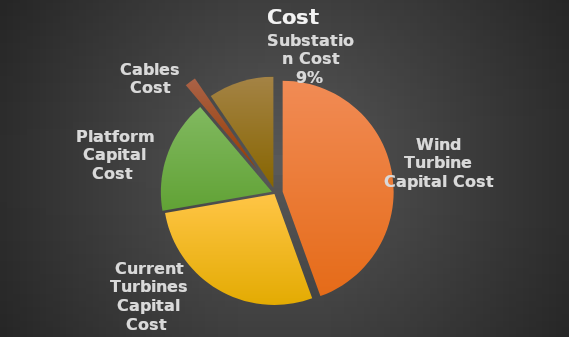
| Category | Series 0 |
|---|---|
| Wind Turbine Capital Cost  | 32640 |
| Current Turbines Capital Cost  | 20400 |
| Platform Capital Cost  | 12148.847 |
| Cables Cost | 1200 |
| Substation Cost | 7000 |